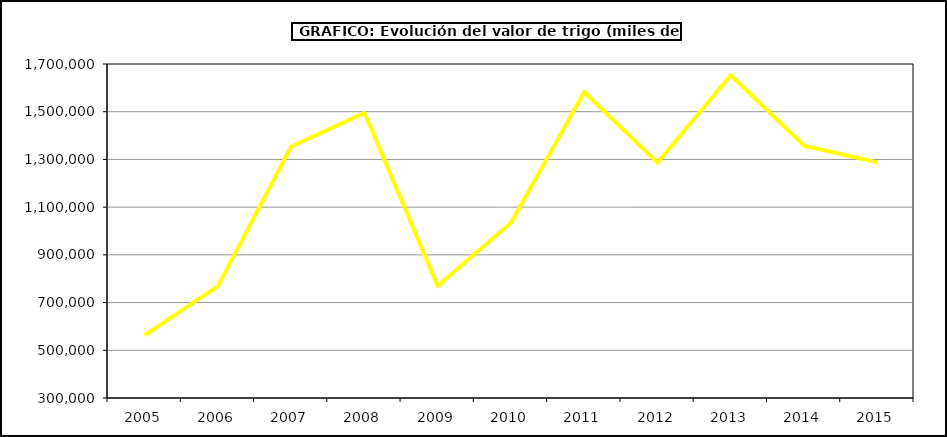
| Category | Valor |
|---|---|
| 2005.0 | 562126.482 |
| 2006.0 | 769156.373 |
| 2007.0 | 1353566.298 |
| 2008.0 | 1495406.813 |
| 2009.0 | 770204.952 |
| 2010.0 | 1034362.398 |
| 2011.0 | 1582317.395 |
| 2012.0 | 1286558.361 |
| 2013.0 | 1652767.635 |
| 2014.0 | 1357332.32 |
| 2015.0 | 1287809 |